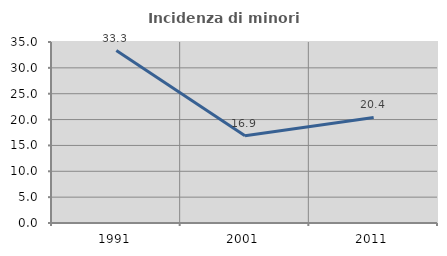
| Category | Incidenza di minori stranieri |
|---|---|
| 1991.0 | 33.333 |
| 2001.0 | 16.883 |
| 2011.0 | 20.415 |